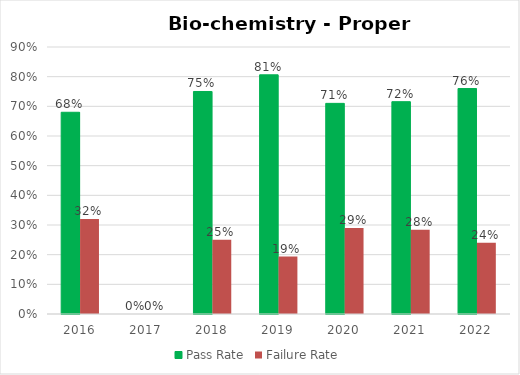
| Category | Pass Rate | Failure Rate |
|---|---|---|
| 2016.0 | 0.68 | 0.32 |
| 2017.0 | 0 | 0 |
| 2018.0 | 0.75 | 0.25 |
| 2019.0 | 0.806 | 0.194 |
| 2020.0 | 0.71 | 0.29 |
| 2021.0 | 0.716 | 0.284 |
| 2022.0 | 0.76 | 0.24 |